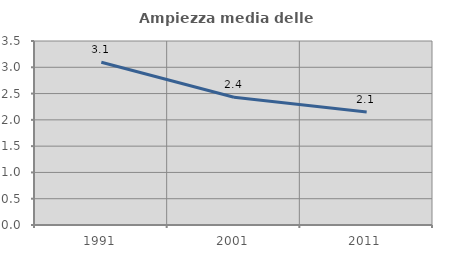
| Category | Ampiezza media delle famiglie |
|---|---|
| 1991.0 | 3.097 |
| 2001.0 | 2.43 |
| 2011.0 | 2.148 |